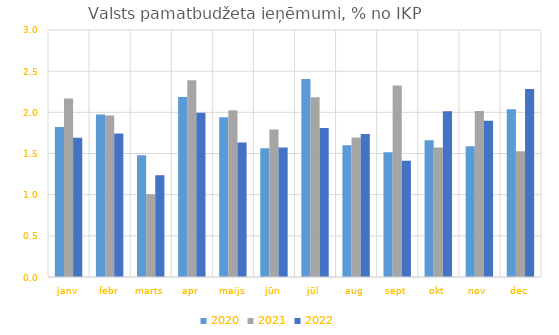
| Category | 2020 | 2021 | 2022 |
|---|---|---|---|
| janv | 1.822 | 2.169 | 1.69 |
| febr | 1.972 | 1.962 | 1.744 |
| marts | 1.478 | 1.005 | 1.236 |
| apr | 2.186 | 2.391 | 1.996 |
| maijs | 1.941 | 2.024 | 1.633 |
| jūn | 1.564 | 1.793 | 1.573 |
| jūl | 2.406 | 2.183 | 1.81 |
| aug | 1.601 | 1.695 | 1.737 |
| sept | 1.514 | 2.326 | 1.411 |
| okt | 1.662 | 1.573 | 2.014 |
| nov | 1.588 | 2.016 | 1.897 |
| dec | 2.038 | 1.529 | 2.284 |